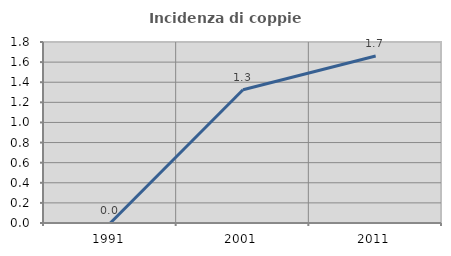
| Category | Incidenza di coppie miste |
|---|---|
| 1991.0 | 0 |
| 2001.0 | 1.325 |
| 2011.0 | 1.661 |